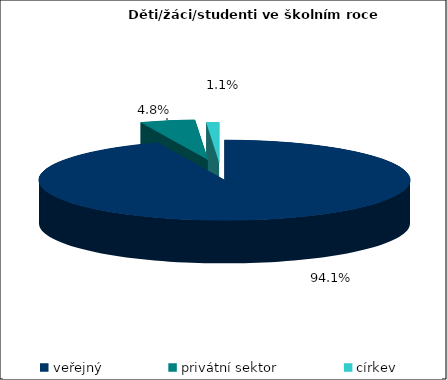
| Category | 2012/13 |
|---|---|
| veřejný | 1567574 |
| privátní sektor | 79647 |
| církev | 18458 |